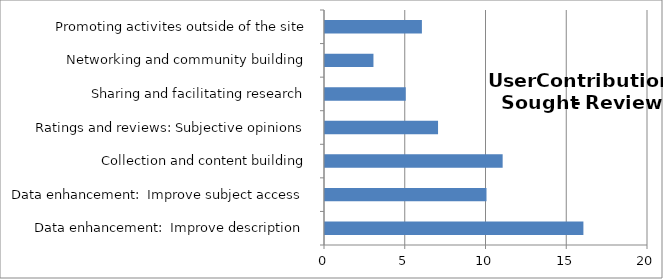
| Category | Series 0 |
|---|---|
| Data enhancement:  Improve description | 16 |
| Data enhancement:  Improve subject access | 10 |
| Collection and content building | 11 |
| Ratings and reviews: Subjective opinions | 7 |
| Sharing and facilitating research | 5 |
| Networking and community building | 3 |
| Promoting activites outside of the site | 6 |